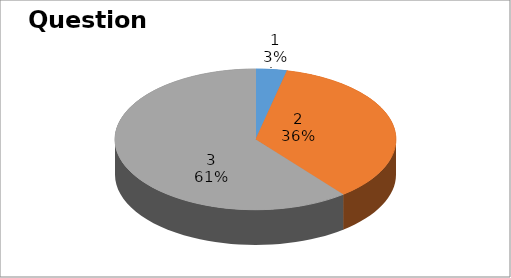
| Category | Series 0 |
|---|---|
| 0 | 1 |
| 1 | 10 |
| 2 | 17 |